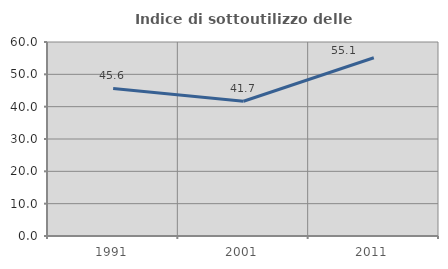
| Category | Indice di sottoutilizzo delle abitazioni  |
|---|---|
| 1991.0 | 45.631 |
| 2001.0 | 41.689 |
| 2011.0 | 55.128 |